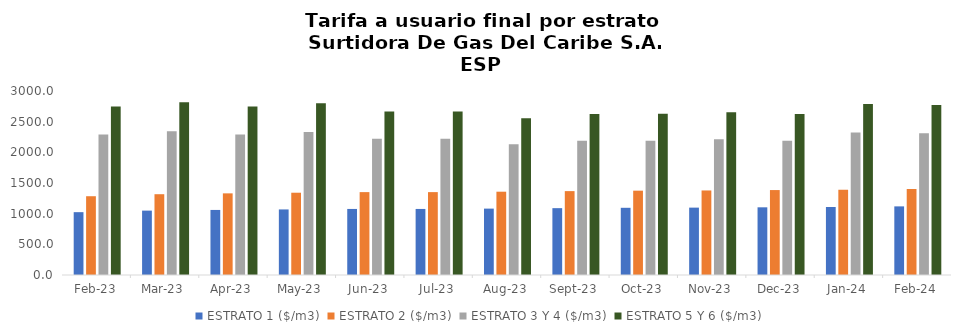
| Category | ESTRATO 1 ($/m3) | ESTRATO 2 ($/m3) | ESTRATO 3 Y 4 ($/m3) | ESTRATO 5 Y 6 ($/m3) |
|---|---|---|---|---|
| 2023-02-01 | 1024.53 | 1284.4 | 2288.91 | 2746.692 |
| 2023-03-01 | 1049.77 | 1317.27 | 2345.6 | 2814.72 |
| 2023-04-01 | 1060.8 | 1331.1 | 2289.32 | 2747.184 |
| 2023-05-01 | 1069.09 | 1341.51 | 2332.27 | 2798.724 |
| 2023-06-01 | 1076.98 | 1351.41 | 2221.89 | 2666.268 |
| 2023-07-01 | 1076.98 | 1351.41 | 2221.89 | 2666.268 |
| 2023-08-01 | 1082.37 | 1358.18 | 2129.89 | 2555.868 |
| 2023-09-01 | 1089.94 | 1367.67 | 2187.17 | 2624.604 |
| 2023-10-01 | 1095.74 | 1374.95 | 2190.44 | 2628.528 |
| 2023-11-01 | 1098.48 | 1378.38 | 2212.27 | 2654.724 |
| 2023-12-01 | 1103.63 | 1384.85 | 2189.08 | 2626.896 |
| 2024-01-01 | 1108.7 | 1391.21 | 2321.9 | 2786.28 |
| 2024-02-01 | 1118.84 | 1403.94 | 2309.92 | 2771.904 |